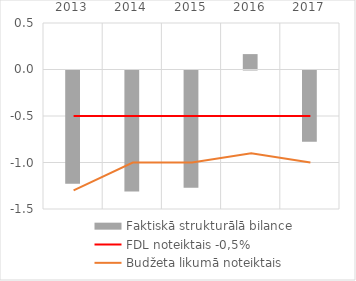
| Category | Faktiskā strukturālā bilance |
|---|---|
| 2013.0 | -1.217 |
| 2014.0 | -1.302 |
| 2015.0 | -1.26 |
| 2016.0 | 0.166 |
| 2017.0 | -0.767 |